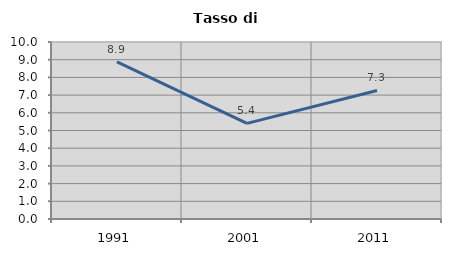
| Category | Tasso di disoccupazione   |
|---|---|
| 1991.0 | 8.882 |
| 2001.0 | 5.401 |
| 2011.0 | 7.262 |